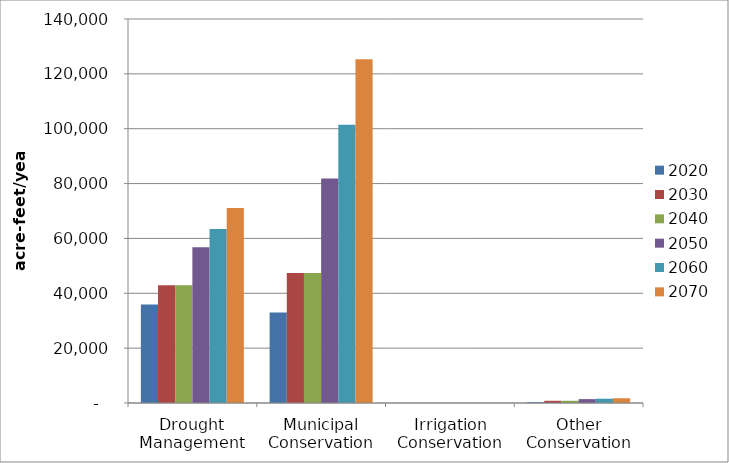
| Category | 2020 | 2030 | 2040 | 2050 | 2060 | 2070 |
|---|---|---|---|---|---|---|
| Drought Management | 35894 | 42962 | 42962 | 56767 | 63451 | 71049 |
| Municipal Conservation | 32952 | 47436 | 47436 | 81877 | 101447 | 125367 |
| Irrigation Conservation | 5 | 8 | 8 | 11 | 11 | 11 |
| Other Conservation | 321 | 811 | 811 | 1414 | 1562 | 1733 |